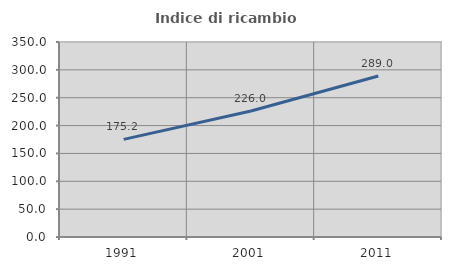
| Category | Indice di ricambio occupazionale  |
|---|---|
| 1991.0 | 175.221 |
| 2001.0 | 226.042 |
| 2011.0 | 288.991 |